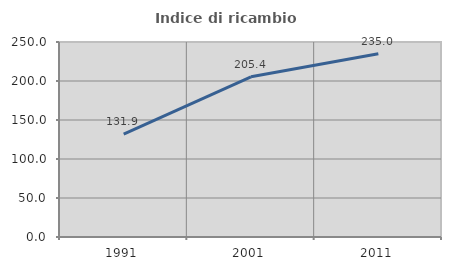
| Category | Indice di ricambio occupazionale  |
|---|---|
| 1991.0 | 131.915 |
| 2001.0 | 205.38 |
| 2011.0 | 234.965 |